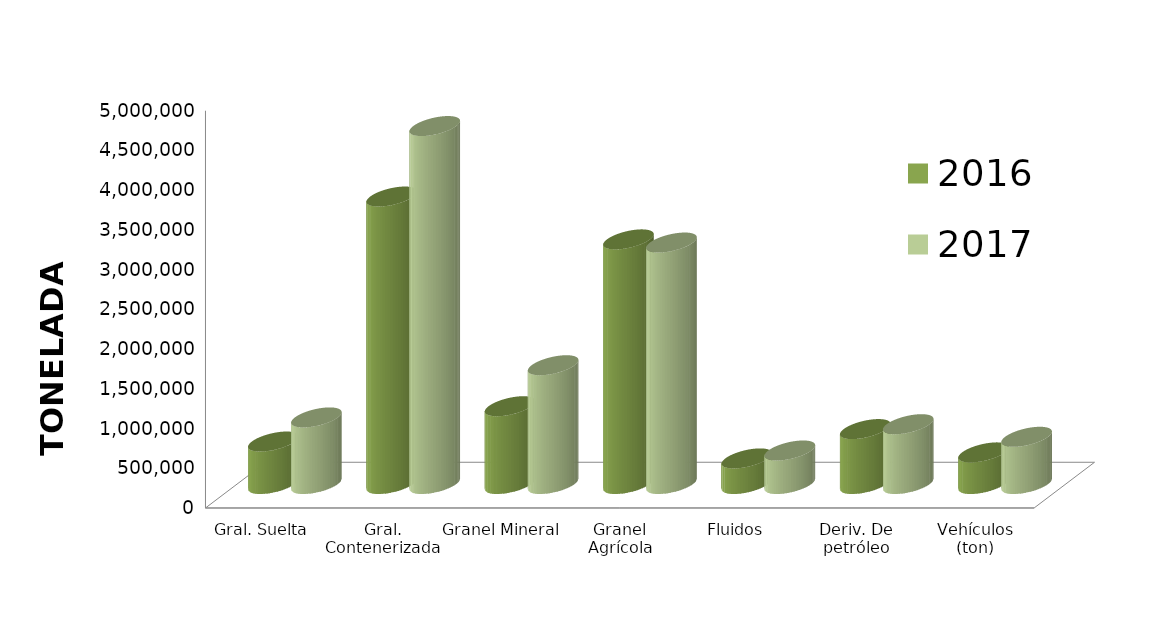
| Category | 2016 | 2017 |
|---|---|---|
| Gral. Suelta | 534379.542 | 837846.415 |
| Gral. Contenerizada | 3617736.588 | 4504912.908 |
| Granel Mineral | 978900.391 | 1494753.5 |
| Granel Agrícola | 3078560.978 | 3038711.087 |
| Fluidos | 321967.831 | 421647.388 |
| Deriv. De petróleo | 691040.017 | 752626.932 |
| Vehículos (ton) | 397738.882 | 594053.187 |